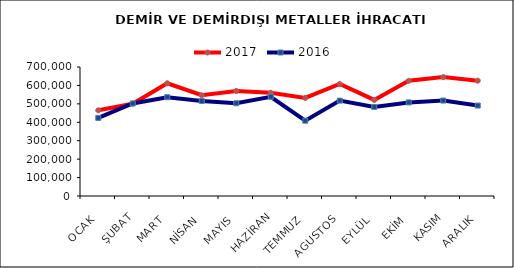
| Category | 2017 | 2016 |
|---|---|---|
| OCAK | 464969.999 | 423834.378 |
| ŞUBAT | 500591.974 | 502325.668 |
| MART | 611739.891 | 536208.321 |
| NİSAN | 546721.024 | 515692.984 |
| MAYIS | 570135.29 | 503328.082 |
| HAZİRAN | 560384.694 | 538464.434 |
| TEMMUZ | 532146.82 | 408611.739 |
| AGUSTOS | 607907.056 | 517488.856 |
| EYLÜL | 521470.946 | 483422.276 |
| EKİM | 625092.851 | 507902.281 |
| KASIM | 645050.81 | 517721.389 |
| ARALIK | 625952.904 | 490788.528 |